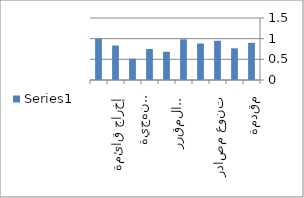
| Category | Series 0 |
|---|---|
| مقدمة | 0.9 |
| حداثة مراجع | 0.767 |
| تنوع مصادر | 0.95 |
| عدد مراجع | 0.883 |
| ارتباط بالمقرر | 0.983 |
| اكتمال معلومات | 0.683 |
| التزام منهجية | 0.75 |
| وصف مختصر | 0.517 |
| إخراج قائمة | 0.833 |
| موعد تسليم | 1 |